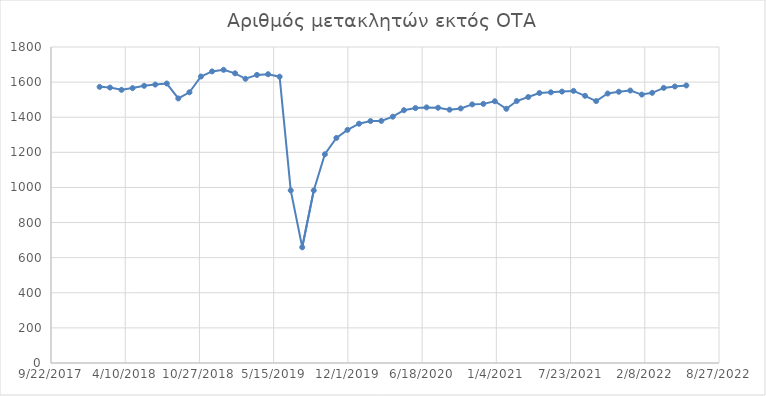
| Category | Αριθμός μετακλητών εκτός ΟΤΑ |
|---|---|
| 43131.0 | 1573 |
| 43159.0 | 1569 |
| 43190.0 | 1556 |
| 43220.0 | 1566 |
| 43251.0 | 1579 |
| 43281.0 | 1586 |
| 43312.0 | 1592 |
| 43343.0 | 1507 |
| 43373.0 | 1542 |
| 43404.0 | 1632 |
| 43434.0 | 1661 |
| 43465.0 | 1670 |
| 43496.0 | 1650 |
| 43524.0 | 1619 |
| 43555.0 | 1641 |
| 43585.0 | 1645 |
| 43616.0 | 1631 |
| 43646.0 | 983 |
| 43677.0 | 659 |
| 43708.0 | 983 |
| 43738.0 | 1189 |
| 43769.0 | 1282 |
| 43799.0 | 1328 |
| 43830.0 | 1363 |
| 43861.0 | 1378 |
| 43890.0 | 1379 |
| 43921.0 | 1403 |
| 43951.0 | 1440 |
| 43982.0 | 1452 |
| 44012.0 | 1456 |
| 44043.0 | 1454 |
| 44074.0 | 1443 |
| 44104.0 | 1450 |
| 44135.0 | 1473 |
| 44165.0 | 1476 |
| 44196.0 | 1491 |
| 44227.0 | 1448 |
| 44255.0 | 1492 |
| 44286.0 | 1515 |
| 44316.0 | 1538 |
| 44347.0 | 1542 |
| 44377.0 | 1546 |
| 44408.0 | 1550 |
| 44439.0 | 1522 |
| 44469.0 | 1492 |
| 44500.0 | 1535 |
| 44530.0 | 1545 |
| 44561.0 | 1552 |
| 44592.0 | 1529 |
| 44620.0 | 1539 |
| 44651.0 | 1567 |
| 44681.0 | 1575 |
| 44712.0 | 1581 |